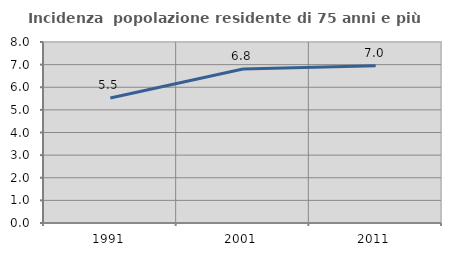
| Category | Incidenza  popolazione residente di 75 anni e più |
|---|---|
| 1991.0 | 5.527 |
| 2001.0 | 6.809 |
| 2011.0 | 6.956 |